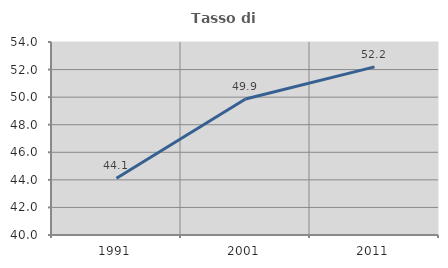
| Category | Tasso di occupazione   |
|---|---|
| 1991.0 | 44.121 |
| 2001.0 | 49.86 |
| 2011.0 | 52.196 |